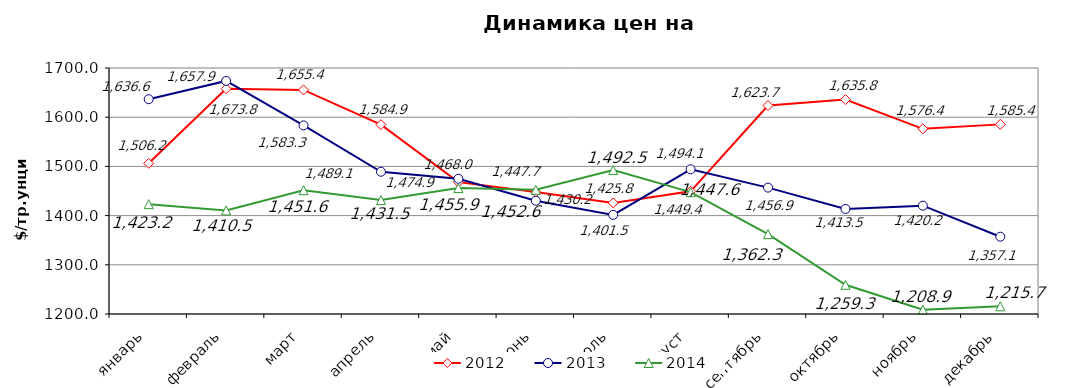
| Category | 2012 | 2013 | 2014 |
|---|---|---|---|
| январь | 1506.24 | 1636.57 | 1423.18 |
| февраль | 1657.86 | 1673.75 | 1410.5 |
| март | 1655.41 | 1583.3 | 1451.62 |
| апрель | 1584.89 | 1489.12 | 1431.5 |
| май | 1468 | 1474.9 | 1455.89 |
| июнь | 1447.74 | 1430.23 | 1452.57 |
| июль | 1425.8 | 1401.48 | 1492.48 |
| август | 1449.4 | 1494.1 | 1447.64 |
| сентябрь | 1623.7 | 1456.86 | 1362.29 |
| октябрь | 1635.83 | 1413.48 | 1259.34 |
| ноябрь | 1576.36 | 1420.19 | 1208.85 |
| декабрь | 1585.42 | 1357.1 | 1215.67 |